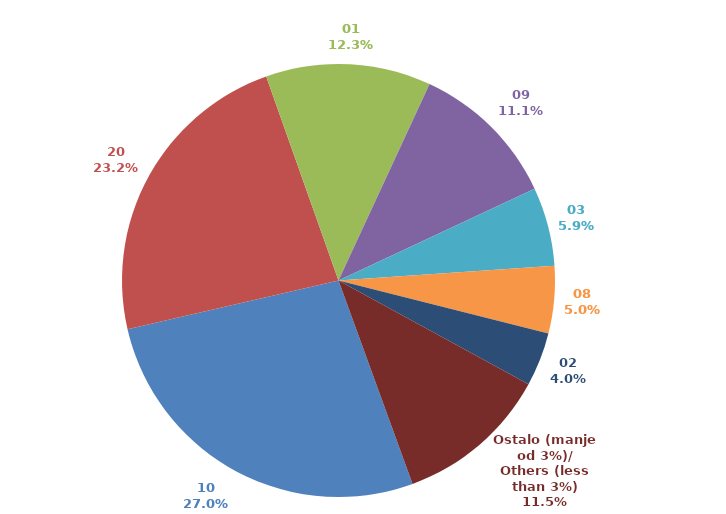
| Category | Series 0 |
|---|---|
| 10 | 0.269 |
| 20 | 0.232 |
| 01 | 0.123 |
| 09 | 0.111 |
| 03 | 0.059 |
| 08 | 0.05 |
| 02 | 0.04 |
| Ostalo (manje od 3%)/
Others (less than 3%) | 0.115 |